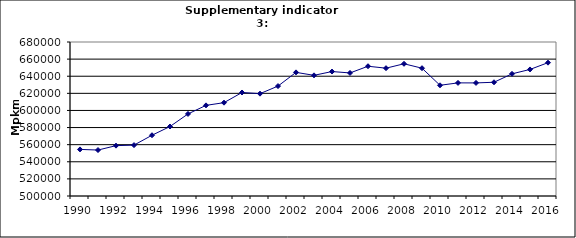
| Category | Passenger transport by cars, Mpkm |
|---|---|
| 1990 | 554446.844 |
| 1991 | 553715.364 |
| 1992 | 558844.084 |
| 1993 | 559476.779 |
| 1994 | 571018.077 |
| 1995 | 581231.361 |
| 1996 | 595924.825 |
| 1997 | 605941.938 |
| 1998 | 609086.786 |
| 1999 | 620975.331 |
| 2000 | 619612.492 |
| 2001 | 628462.659 |
| 2002 | 644507.768 |
| 2003 | 641031.778 |
| 2004 | 645482.446 |
| 2005 | 643839.242 |
| 2006 | 651672.785 |
| 2007 | 649397.874 |
| 2008 | 654532.273 |
| 2009 | 649381.954 |
| 2010 | 629402.621 |
| 2011 | 632220.992 |
| 2012 | 632177.069 |
| 2013 | 632944.972 |
| 2014 | 642795.642 |
| 2015 | 647914.861 |
| 2016 | 655855.614 |